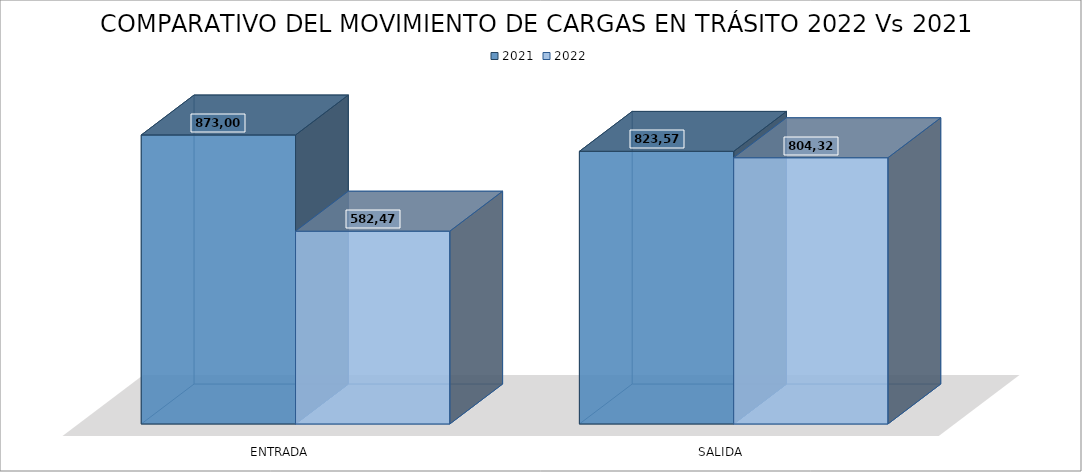
| Category | 2021 | 2022 |
|---|---|---|
| ENTRADA | 873009 | 582473 |
|  SALIDA | 823573 | 804324 |